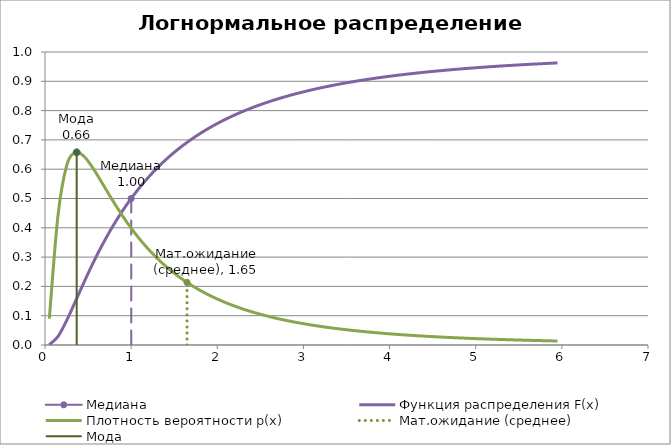
| Category | Медиана |
|---|---|
| 1.0 | 0.5 |
| 1.0 | 0 |